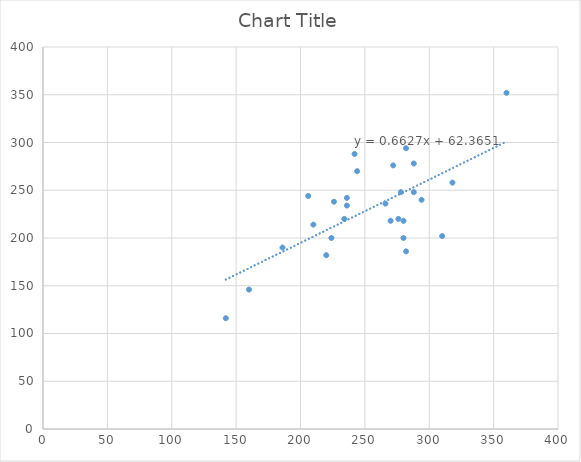
| Category | Series 0 |
|---|---|
| 270.0 | 218 |
| 236.0 | 234 |
| 210.0 | 214 |
| 142.0 | 116 |
| 280.0 | 200 |
| 272.0 | 276 |
| 160.0 | 146 |
| 220.0 | 182 |
| 226.0 | 238 |
| 242.0 | 288 |
| 186.0 | 190 |
| 266.0 | 236 |
| 206.0 | 244 |
| 318.0 | 258 |
| 294.0 | 240 |
| 282.0 | 294 |
| 234.0 | 220 |
| 224.0 | 200 |
| 276.0 | 220 |
| 282.0 | 186 |
| 360.0 | 352 |
| 310.0 | 202 |
| 280.0 | 218 |
| 278.0 | 248 |
| 288.0 | 278 |
| 288.0 | 248 |
| 244.0 | 270 |
| 236.0 | 242 |